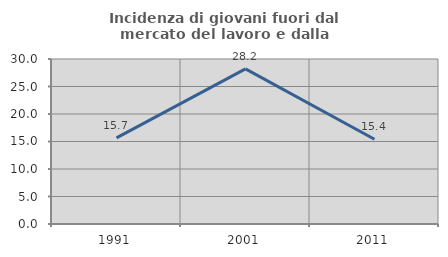
| Category | Incidenza di giovani fuori dal mercato del lavoro e dalla formazione  |
|---|---|
| 1991.0 | 15.651 |
| 2001.0 | 28.193 |
| 2011.0 | 15.409 |